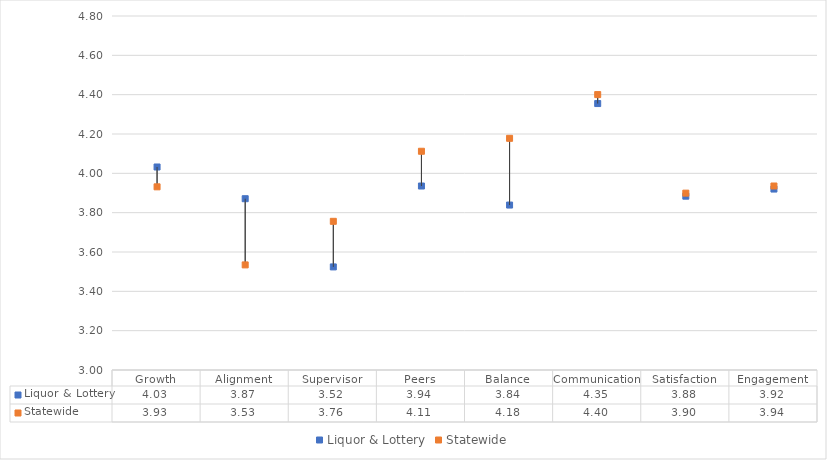
| Category | Liquor & Lottery | Statewide |
|---|---|---|
| Growth | 4.032 | 3.931 |
| Alignment | 3.871 | 3.534 |
| Supervisor | 3.524 | 3.756 |
| Peers | 3.935 | 4.112 |
| Balance | 3.839 | 4.178 |
| Communication | 4.355 | 4.4 |
| Satisfaction | 3.884 | 3.899 |
| Engagement | 3.92 | 3.936 |